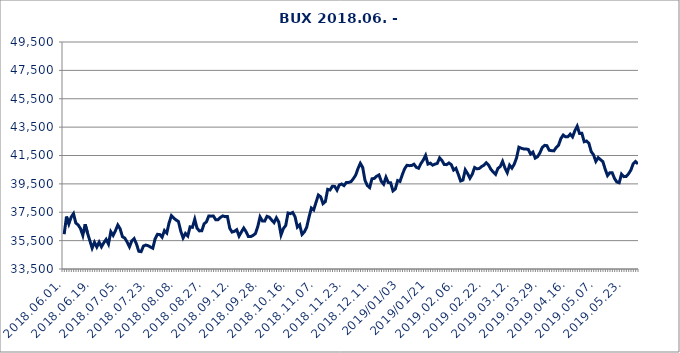
| Category | Series 0 |
|---|---|
| 2018.06.01. | 35952.676 |
| 2018.06.04. | 37194.372 |
| 2018.06.05. | 36677.561 |
| 2018.06.06. | 37157.464 |
| 2018.06.07. | 37401.246 |
| 2018.06.08. | 36738.315 |
| 2018.06.11. | 36606.384 |
| 2018.06.12. | 36348.106 |
| 2018.06.13. | 35868.589 |
| 2018.06.14. | 36654.567 |
| 2018.06.15. | 36038.956 |
| 2018.06.18. | 35505.465 |
| 2018.06.19. | 34972.348 |
| 2018.06.20. | 35383.574 |
| 2018.06.21. | 35049.552 |
| 2018.06.22. | 35396.618 |
| 2018.06.25. | 35064.749 |
| 2018.06.26. | 35352.026 |
| 2018.06.27. | 35587.462 |
| 2018.06.28. | 35258.852 |
| 2018.06.29. | 36127.708 |
| 2018.07.02. | 35867.746 |
| 2018.07.03. | 36204.299 |
| 2018.07.04. | 36600.249 |
| 2018.07.05. | 36335.094 |
| 2018.07.06. | 35775.734 |
| 2018.07.09. | 35676.821 |
| 2018.07.10. | 35403.198 |
| 2018.07.11. | 35063.073 |
| 2018.07.12. | 35485.868 |
| 2018.07.13. | 35641.757 |
| 2018.07.16. | 35267.069 |
| 2018.07.17. | 34751.127 |
| 2018.07.18. | 34720.307 |
| 2018.07.19. | 35117.829 |
| 2018.07.20. | 35186.519 |
| 2018.07.23. | 35141.027 |
| 2018.07.24. | 35049.71 |
| 2018.07.25. | 34963.193 |
| 2018.07.26. | 35624.912 |
| 2018.07.27. | 35943.642 |
| 2018.07.30. | 35931.234 |
| 2018.07.31. | 35742.058 |
| 2018.08.01. | 36207.717 |
| 2018.08.02. | 36035.461 |
| 2018.08.03. | 36760.004 |
| 2018.08.06. | 37259.801 |
| 2018.08.07. | 37087.753 |
| 2018.08.08. | 36954.164 |
| 2018.08.09. | 36844.993 |
| 2018.08.10. | 36171.258 |
| 2018.08.13. | 35693.828 |
| 2018.08.14. | 36006.196 |
| 2018.08.15. | 35826.141 |
| 2018.08.16. | 36472.99 |
| 2018.08.17. | 36436.959 |
| 2018.08.21. | 37007.662 |
| 2018.08.22. | 36365.904 |
| 2018.08.23. | 36186.315 |
| 2018.08.24. | 36192.132 |
| 2018.08.27. | 36685.79 |
| 2018.08.28. | 36818.931 |
| 2018.08.29. | 37234.858 |
| 2018.08.30. | 37225.076 |
| 2018.08.31. | 37233.402 |
| 2018.09.03. | 36971.856 |
| 2018.09.04. | 36968.107 |
| 2018.09.05. | 37135.328 |
| 2018.09.06. | 37241.816 |
| 2018.09.07. | 37189.976 |
| 2018.09.10. | 37202.889 |
| 2018.09.11. | 36371.943 |
| 2018.09.12. | 36104.073 |
| 2018.09.13. | 36156.035 |
| 2018.09.14. | 36269.166 |
| 2018.09.17. | 35819.9 |
| 2018.09.18. | 36110.885 |
| 2018.09.19. | 36386.403 |
| 2018.09.20. | 36134.329 |
| 2018.09.21. | 35783.48 |
| 2018.09.24. | 35786.545 |
| 2018.09.25. | 35868.88 |
| 2018.09.26. | 35996.041 |
| 2018.09.27. | 36471.348 |
| 2018.09.28. | 37171.414 |
| 2018.10.01. | 36883.492 |
| 2018.10.02. | 36876.748 |
| 2018.10.03. | 37212.945 |
| 2018.10.04. | 37146.727 |
| 2018.10.05. | 36945.25 |
| 2018.10.08. | 36768.023 |
| 2018.10.09. | 37109.241 |
| 2018.10.10. | 36821.117 |
| 2018.10.11. | 35904.542 |
| 2018.10.12. | 36347.89 |
| 2018.10.15. | 36564.15 |
| 2018.10.16. | 37445.673 |
| 2018.10.17. | 37399.11 |
| 2018.10.18. | 37485.015 |
| 2018.10.19. | 37185.929 |
| 2018.10.24. | 36452.736 |
| 2018.10.25. | 36617.542 |
| 2018.10.26. | 35937.614 |
| 2018.10.29. | 36110.122 |
| 2018.10.30. | 36444.725 |
| 2018.10.31. | 37155.206 |
| 2018.11.05. | 37794.87 |
| 2018.11.06. | 37666.001 |
| 2018.11.07. | 38197.997 |
| 2018.11.08. | 38713.446 |
| 2018.11.09. | 38586.627 |
| 2018.11.12. | 38108.455 |
| 2018.11.13. | 38252.647 |
| 2018.11.14. | 39115.558 |
| 2018.11.15. | 39070.967 |
| 2018.11.16. | 39328.386 |
| 2018.11.19. | 39323.012 |
| 2018.11.20. | 39058.304 |
| 2018.11.21. | 39431.33 |
| 2018.11.22. | 39489.376 |
| 2018.11.23. | 39379.776 |
| 2018.11.26. | 39598.286 |
| 2018.11.27. | 39601.698 |
| 2018.11.28. | 39656.246 |
| 2018.11.29. | 39861.634 |
| 2018.11.30. | 40109.366 |
| 2018.12.03. | 40579.822 |
| 2018.12.04. | 40945.474 |
| 2018.12.05. | 40670.445 |
| 2018.12.06. | 39747.127 |
| 2018.12.07. | 39384.556 |
| 2018.12.10. | 39238.436 |
| 2018.12.11. | 39860.234 |
| 2018.12.12. | 39887.22 |
| 2018.12.13. | 40041.705 |
| 2018.12.14. | 40125.722 |
| 2018.12.17. | 39675.759 |
| 2018.12.18. | 39475.607 |
| 2018.12.19. | 39966.192 |
| 2018.12.20. | 39592.675 |
| 2018.12.21. | 39578.632 |
| 2018.12.27. | 39006.517 |
| 2018.12.28. | 39138.949 |
| 2019.01.02 | 39734.064 |
| 2019.01.03 | 39672.597 |
| 2019.01.04 | 40145.177 |
| 2019.01.07 | 40569.468 |
| 2019.01.08 | 40809.819 |
| 2019.01.09 | 40784.268 |
| 2019.01.10 | 40795.505 |
| 2019.01.11 | 40886.064 |
| 2019.01.14 | 40667.654 |
| 2019.01.15 | 40600.26 |
| 2019.01.16 | 40933.043 |
| 2019.01.17 | 41180.049 |
| 2019.01.18 | 41503.905 |
| 2019.01.21 | 40893.713 |
| 2019.01.22 | 40963.712 |
| 2019.01.23 | 40818.686 |
| 2019.01.24 | 40890.939 |
| 2019.01.25 | 40944.824 |
| 2019.01.28 | 41332.315 |
| 2019.01.29 | 41146 |
| 2019.01.30 | 40862.967 |
| 2019.01.31 | 40855.561 |
| 2019.02.01. | 40973.34 |
| 2019.02.04. | 40856.968 |
| 2019.02.05. | 40474.394 |
| 2019.02.06. | 40597.263 |
| 2019.02.07. | 40173.726 |
| 2019.02.08. | 39704.61 |
| 2019.02.11. | 39769.479 |
| 2019.02.12. | 40488.09 |
| 2019.02.13. | 40221.18 |
| 2019.02.14. | 39898.653 |
| 2019.02.15. | 40179.836 |
| 2019.02.18. | 40653.387 |
| 2019.02.19. | 40560.444 |
| 2019.02.20. | 40582.832 |
| 2019.02.21. | 40721.477 |
| 2019.02.22. | 40814.595 |
| 2019.02.25. | 40987.946 |
| 2019.02.26. | 40819.081 |
| 2019.02.27. | 40525.284 |
| 2019.02.28. | 40333.039 |
| 2019.03.01. | 40170.655 |
| 2019.03.04. | 40593.477 |
| 2019.03.05. | 40718.497 |
| 2019.03.06. | 41086.897 |
| 2019.03.07. | 40625.302 |
| 2019.03.08. | 40288.437 |
| 2019.03.11. | 40819.551 |
| 2019.03.12. | 40612.503 |
| 2019.03.13. | 40887.578 |
| 2019.03.14. | 41335.024 |
| 2019.03.18. | 42085.013 |
| 2019.03.19. | 42014.162 |
| 2019.03.20. | 41964.35 |
| 2019.03.21. | 41955.752 |
| 2019.03.22. | 41931.67 |
| 2019.03.25. | 41605.172 |
| 2019.03.26. | 41740.966 |
| 2019.03.27. | 41316.196 |
| 2019.03.28. | 41413.909 |
| 2019.03.29. | 41683.78 |
| 2019.04.01. | 42057.333 |
| 2019.04.02. | 42213.346 |
| 2019.04.03. | 42193.967 |
| 2019.04.04. | 41870.438 |
| 2019.04.05. | 41841.921 |
| 2019.04.08. | 41826.902 |
| 2019.04.09. | 42063.939 |
| 2019.04.10. | 42225.867 |
| 2019.04.11. | 42693.515 |
| 2019.04.12. | 42940.74 |
| 2019.04.15. | 42815.922 |
| 2019.04.16. | 42826.299 |
| 2019.04.17. | 43004.506 |
| 2019.04.18. | 42810.106 |
| 2019.04.23. | 43245.434 |
| 2019.04.24. | 43563.383 |
| 2019.04.25. | 43053.87 |
| 2019.04.26. | 43064.395 |
| 2019.04.29. | 42469.842 |
| 2019.04.30. | 42520.113 |
| 2019.05.02. | 42366.822 |
| 2019.05.03. | 41775.362 |
| 2019.05.06. | 41547.348 |
| 2019.05.07. | 41084.566 |
| 2019.05.08. | 41350.332 |
| 2019.05.09. | 41207.462 |
| 2019.05.10. | 41068.206 |
| 2019.05.13. | 40537.85 |
| 2019.05.14. | 40084.639 |
| 2019.05.15. | 40291.354 |
| 2019.05.16. | 40288.281 |
| 2019.05.17. | 39877.816 |
| 2019.05.20. | 39630.707 |
| 2019.05.21. | 39575.984 |
| 2019.05.22. | 40184.851 |
| 2019.05.23. | 40010.724 |
| 2019.05.24. | 40022.617 |
| 2019.05.27. | 40207.91 |
| 2019.05.28. | 40466.853 |
| 2019.05.29. | 40916.417 |
| 2019.05.30. | 41075.874 |
| 2019.05.31. | 40904.115 |